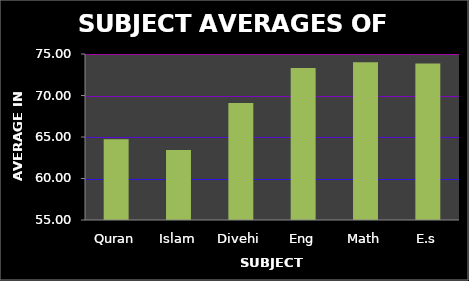
| Category | Series 0 |
|---|---|
| Quran | 64.724 |
| Islam | 63.448 |
| Divehi | 69.103 |
| Eng | 73.31 |
| Math | 74 |
| E.s | 73.862 |